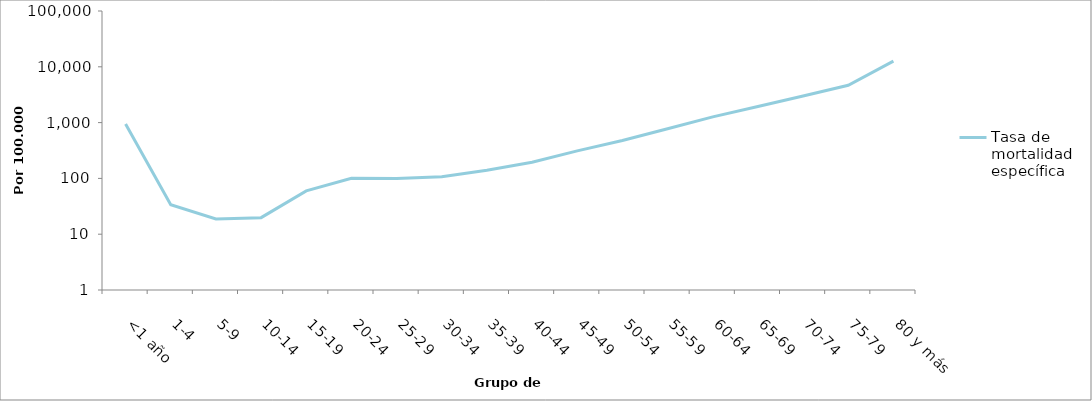
| Category | Tasa de mortalidad específica |
|---|---|
| <1 año | 947.285 |
| 1-4 | 33.648 |
| 5-9 | 18.728 |
| 10-14 | 19.786 |
| 15-19 | 59.778 |
| 20-24 | 100.735 |
| 25-29 | 99.801 |
| 30-34 | 107.046 |
| 35-39 | 140.336 |
| 40-44 | 195.204 |
| 45-49 | 310.875 |
| 50-54 | 476.767 |
| 55-59 | 776.138 |
| 60-64 | 1265.083 |
| 65-69 | 1947.975 |
| 70-74 | 3003.198 |
| 75-79 | 4675.659 |
| 80 y más | 12662.372 |